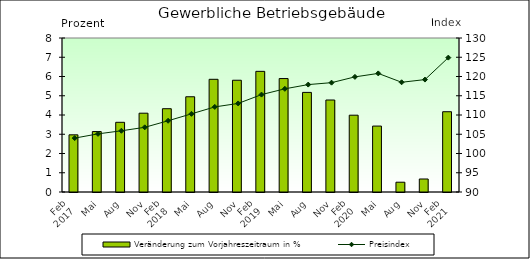
| Category | Veränderung zum Vorjahreszeitraum in % |
|---|---|
| 0 | 2.97 |
| 1 | 3.14 |
| 2 | 3.62 |
| 3 | 4.094 |
| 4 | 4.327 |
| 5 | 4.948 |
| 6 | 5.855 |
| 7 | 5.805 |
| 8 | 6.267 |
| 9 | 5.893 |
| 10 | 5.174 |
| 11 | 4.779 |
| 12 | 3.99 |
| 13 | 3.425 |
| 14 | 0.509 |
| 15 | 0.676 |
| 16 | 4.17 |